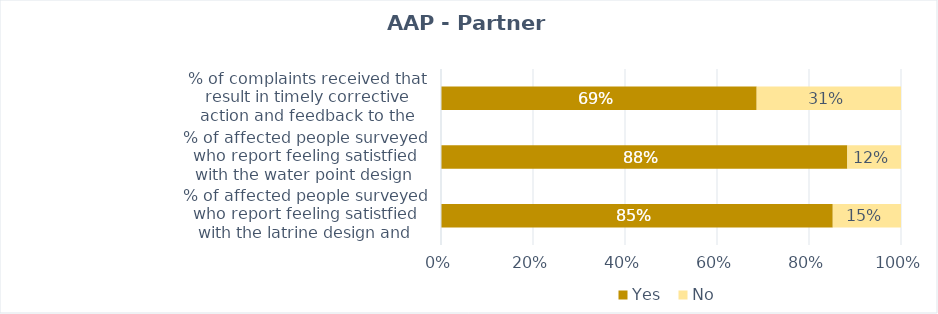
| Category | Yes | No |
|---|---|---|
| % of affected people surveyed who report feeling satistfied with the latrine design and sanitation service | 0.852 | 0.148 |
| % of affected people surveyed who report feeling satistfied with the water point design and water service | 0.883 | 0.117 |
| % of complaints received that result in timely corrective action and feedback to the community | 0.686 | 0.314 |